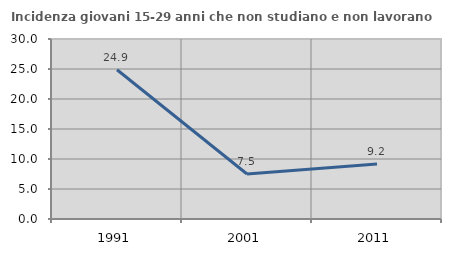
| Category | Incidenza giovani 15-29 anni che non studiano e non lavorano  |
|---|---|
| 1991.0 | 24.873 |
| 2001.0 | 7.5 |
| 2011.0 | 9.169 |